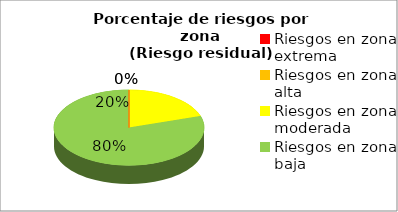
| Category | Series 0 | Series 1 |
|---|---|---|
| Riesgos en zona extrema | 0 | 0 |
| Riesgos en zona alta | 0 | 0 |
| Riesgos en zona moderada | 5 | 0.2 |
| Riesgos en zona baja | 20 | 0.8 |